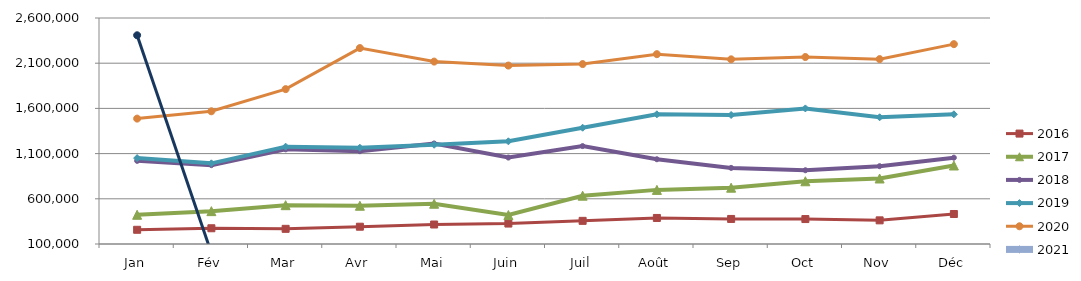
| Category | 2015 | 2016 | 2017 | 2018 | 2019 | 2020 | 2021 |
|---|---|---|---|---|---|---|---|
| Jan |  | 257238.227 | 423360.679 | 1019658.015 | 1050220.805 | 1487095.506 | 2408854.792 |
| Fév |  | 274182.928 | 463512.001 | 972274.256 | 992184.961 | 1568141.915 | 0 |
| Mar |  | 267739.55 | 529345.368 | 1147166.528 | 1176757.88 | 1813146.21 | 0 |
| Avr |  | 291238.37 | 523228.337 | 1126714.531 | 1164825.987 | 2267448.511 | 0 |
| Mai |  | 315573.949 | 545414.731 | 1212070.878 | 1197851.486 | 2117791.111 | 0 |
| Juin |  | 326203.362 | 420430.116 | 1056092.947 | 1235809.908 | 2073858.17 | 0 |
| Juil |  | 356111.54 | 634345.533 | 1183060.966 | 1386180.582 | 2090325.728 | 0 |
| Août |  | 388007.58 | 698691.374 | 1037606.311 | 1534426.4 | 2199836.197 | 0 |
| Sep |  | 377114.56 | 722782.357 | 941820.554 | 1527323.009 | 2142727.977 | 0 |
| Oct |  | 376009.188 | 793837.955 | 915772.772 | 1599889.902 | 2168338.194 | 0 |
| Nov |  | 361587.784 | 824574.744 | 960817.552 | 1501599.407 | 2145083.497 | 0 |
| Déc |  | 431907.412 | 968412.649 | 1054685.303 | 1534756.751 | 2310730.947 | 0 |